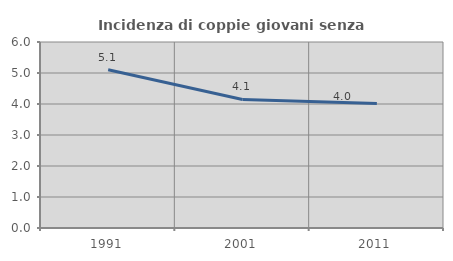
| Category | Incidenza di coppie giovani senza figli |
|---|---|
| 1991.0 | 5.102 |
| 2001.0 | 4.147 |
| 2011.0 | 4.018 |